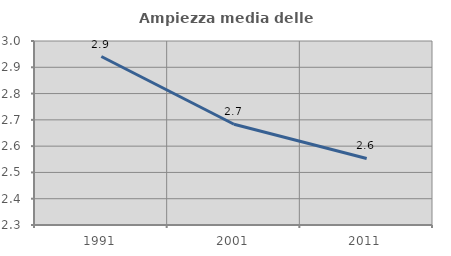
| Category | Ampiezza media delle famiglie |
|---|---|
| 1991.0 | 2.941 |
| 2001.0 | 2.683 |
| 2011.0 | 2.553 |